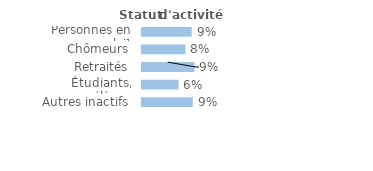
| Category | Series 0 |
|---|---|
| Personnes en emploi¹ | 0.088 |
| Chômeurs | 0.077 |
| Retraités | 0.093 |
| Étudiants, élèves | 0.064 |
| Autres inactifs  | 0.09 |